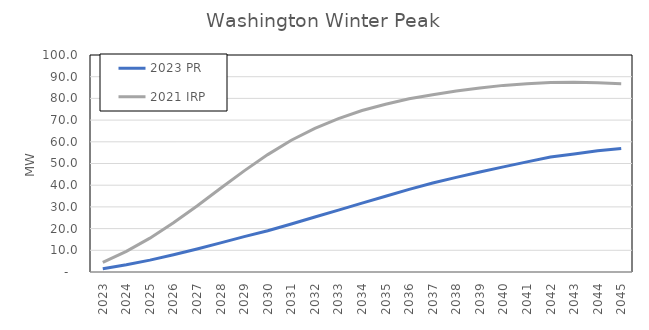
| Category | 2023 PR | 2021 IRP |
|---|---|---|
| 2023.0 | 1.491 | 4.4 |
| 2024.0 | 3.354 | 9.5 |
| 2025.0 | 5.47 | 15.6 |
| 2026.0 | 7.956 | 22.7 |
| 2027.0 | 10.618 | 30.4 |
| 2028.0 | 13.417 | 38.6 |
| 2029.0 | 16.294 | 46.6 |
| 2030.0 | 19.009 | 54.1 |
| 2031.0 | 22.113 | 60.7 |
| 2032.0 | 25.324 | 66.2 |
| 2033.0 | 28.539 | 70.7 |
| 2034.0 | 31.766 | 74.4 |
| 2035.0 | 34.936 | 77.3 |
| 2036.0 | 38.049 | 79.8 |
| 2037.0 | 41.029 | 81.7 |
| 2038.0 | 43.609 | 83.4 |
| 2039.0 | 46.079 | 84.8 |
| 2040.0 | 48.438 | 86 |
| 2041.0 | 50.758 | 86.8 |
| 2042.0 | 53.029 | 87.3 |
| 2043.0 | 54.415 | 87.4 |
| 2044.0 | 55.867 | 87.2 |
| 2045.0 | 56.89 | 86.8 |